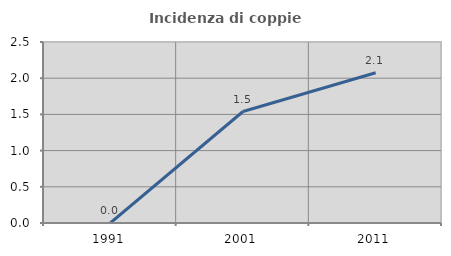
| Category | Incidenza di coppie miste |
|---|---|
| 1991.0 | 0 |
| 2001.0 | 1.54 |
| 2011.0 | 2.075 |